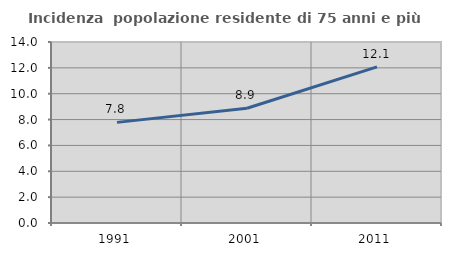
| Category | Incidenza  popolazione residente di 75 anni e più |
|---|---|
| 1991.0 | 7.784 |
| 2001.0 | 8.875 |
| 2011.0 | 12.072 |